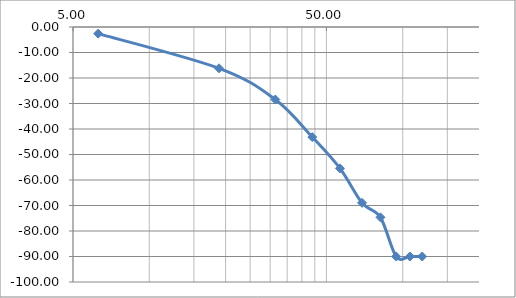
| Category | Series 0 |
|---|---|
| 6.283185307179586 | -2.605 |
| 18.84955592153876 | -16.205 |
| 31.41592653589793 | -28.437 |
| 43.982297150257104 | -43.174 |
| 56.548667764616276 | -55.44 |
| 69.11503837897544 | -68.961 |
| 81.68140899333463 | -74.641 |
| 94.24777960769379 | -90 |
| 106.81415022205297 | -90 |
| 119.38052083641213 | -90 |